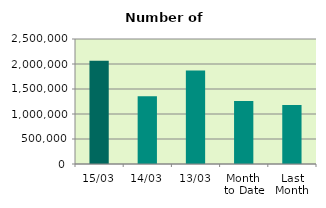
| Category | Series 0 |
|---|---|
| 15/03 | 2063026 |
| 14/03 | 1354086 |
| 13/03 | 1867794 |
| Month 
to Date | 1259371.636 |
| Last
Month | 1180310.4 |